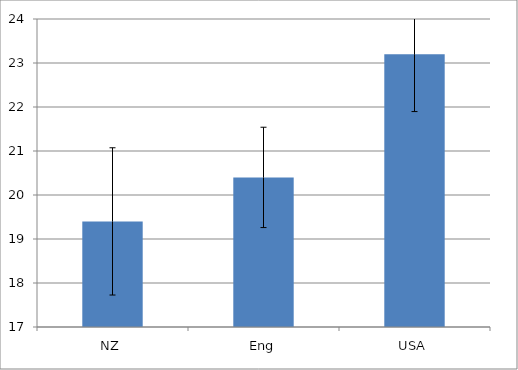
| Category | Series 0 |
|---|---|
| NZ | 19.4 |
| Eng | 20.4 |
| USA | 23.2 |